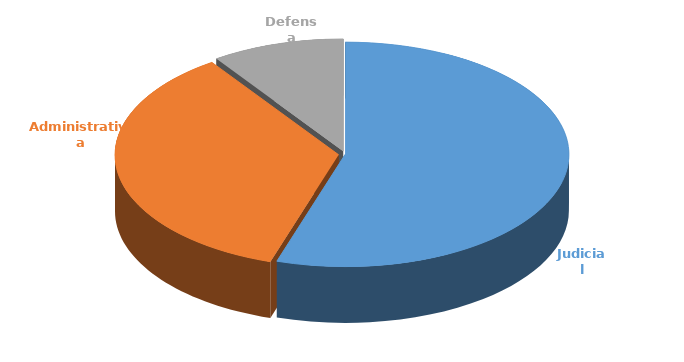
| Category | Cantidad |
|---|---|
| Judicial | 378 |
| Administrativa | 244 |
| Defensa | 66 |